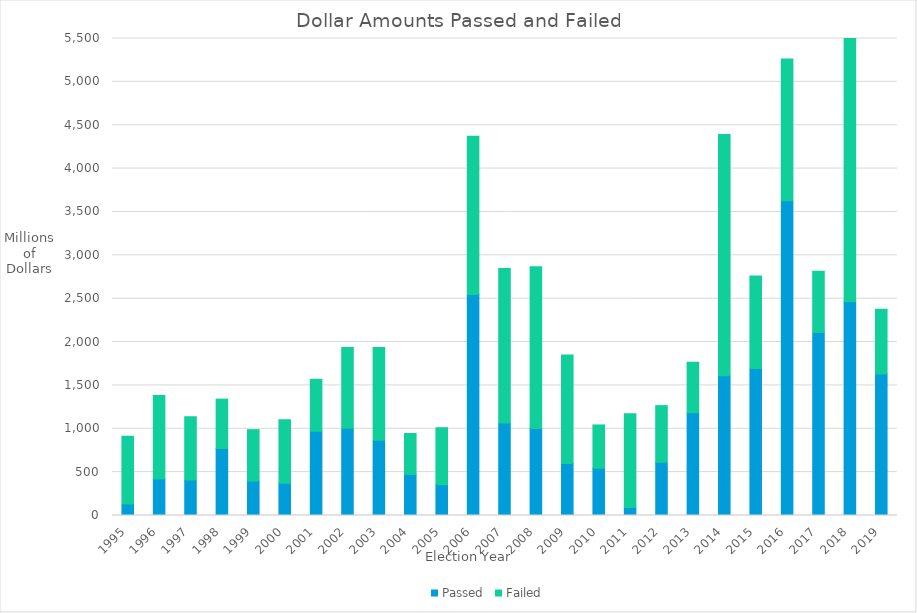
| Category | Passed | Failed |
|---|---|---|
| 1995 | 131450000 | 783561487 |
| 1996 | 421404000 | 962286422 |
| 1997 | 408240000 | 729243606 |
| 1998 | 772752508 | 568890944 |
| 1999 | 396513000 | 593285497 |
| 2000 | 372854664 | 732265400 |
| 2001 | 971542500 | 598994564 |
| 2002 | 1006632066 | 930412984 |
| 2003 | 867987062 | 1068890777 |
| 2004 | 474388785 | 471257658 |
| 2005 | 355215839 | 656797586 |
| 2006 | 2548648970 | 1823933514 |
| 2007 | 1066782891 | 1781442844 |
| 2008 | 1002122000 | 1865605845 |
| 2009 | 600896550 | 1248876038 |
| 2010 | 544995000 | 499160000 |
| 2011 | 91490000 | 1082909702 |
| 2012 | 613531500 | 653475000 |
| 2013 | 1184837000 | 582293791 |
| 2014 | 1611200000 | 2781466156 |
| 2015 | 1696275474 | 1065535121 |
| 2016 | 3627959242 | 1636352563 |
| 2017 | 2110180773 | 706239039 |
| 2018 | 2463462812 | 3322431861 |
| 2019 | 1632908000 | 745700000 |